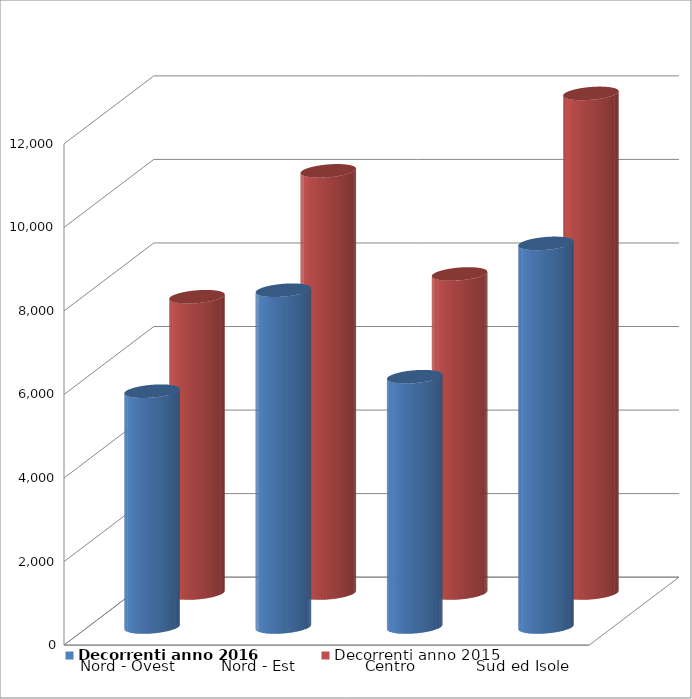
| Category | Decorrenti anno 2016 | Decorrenti anno 2015 |
|---|---|---|
| Nord - Ovest | 5645 | 7093 |
| Nord - Est | 8062 | 10106 |
| Centro | 5992 | 7638 |
| Sud ed Isole | 9183 | 11960 |